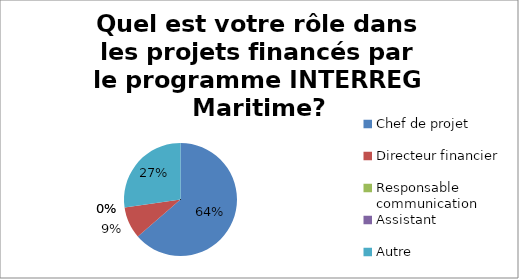
| Category | Quel est votre rôle dans les projets financés par le programme INTERREG Maritime? |
|---|---|
| Chef de projet | 14 |
| Directeur financier | 2 |
| Responsable communication | 0 |
| Assistant | 0 |
| Autre | 6 |